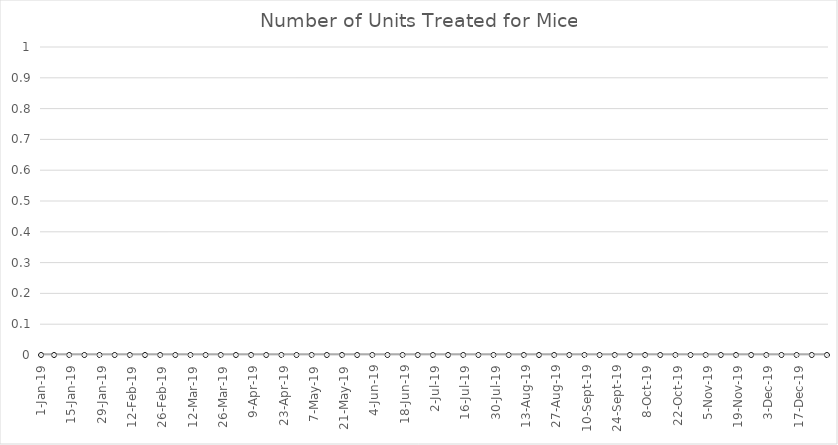
| Category | Series 245 |
|---|---|
| 2019-01-01 | 0 |
| 2019-01-07 | 0 |
| 2019-01-14 | 0 |
| 2019-01-21 | 0 |
| 2019-01-28 | 0 |
| 2019-02-04 | 0 |
| 2019-02-11 | 0 |
| 2019-02-18 | 0 |
| 2019-02-25 | 0 |
| 2019-03-04 | 0 |
| 2019-03-11 | 0 |
| 2019-03-18 | 0 |
| 2019-03-25 | 0 |
| 2019-04-01 | 0 |
| 2019-04-08 | 0 |
| 2019-04-15 | 0 |
| 2019-04-22 | 0 |
| 2019-04-29 | 0 |
| 2019-05-06 | 0 |
| 2019-05-13 | 0 |
| 2019-05-20 | 0 |
| 2019-05-27 | 0 |
| 2019-06-03 | 0 |
| 2019-06-10 | 0 |
| 2019-06-17 | 0 |
| 2019-06-24 | 0 |
| 2019-07-01 | 0 |
| 2019-07-08 | 0 |
| 2019-07-15 | 0 |
| 2019-07-22 | 0 |
| 2019-07-29 | 0 |
| 2019-08-05 | 0 |
| 2019-08-12 | 0 |
| 2019-08-19 | 0 |
| 2019-08-26 | 0 |
| 2019-09-02 | 0 |
| 2019-09-09 | 0 |
| 2019-09-16 | 0 |
| 2019-09-23 | 0 |
| 2019-09-30 | 0 |
| 2019-10-07 | 0 |
| 2019-10-14 | 0 |
| 2019-10-21 | 0 |
| 2019-10-28 | 0 |
| 2019-11-04 | 0 |
| 2019-11-11 | 0 |
| 2019-11-18 | 0 |
| 2019-11-25 | 0 |
| 2019-12-02 | 0 |
| 2019-12-09 | 0 |
| 2019-12-16 | 0 |
| 2019-12-23 | 0 |
| 2019-12-30 | 0 |